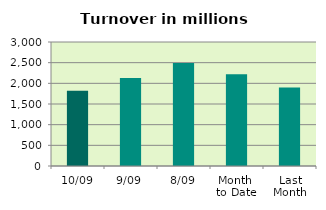
| Category | Series 0 |
|---|---|
| 10/09 | 1819.738 |
| 9/09 | 2130.32 |
| 8/09 | 2490.198 |
| Month 
to Date | 2217.195 |
| Last
Month | 1896.825 |